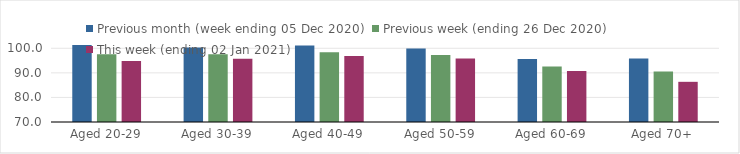
| Category | Previous month (week ending 05 Dec 2020) | Previous week (ending 26 Dec 2020) | This week (ending 02 Jan 2021) |
|---|---|---|---|
| Aged 20-29 | 101.32 | 97.61 | 94.85 |
| Aged 30-39 | 100.3 | 97.61 | 95.76 |
| Aged 40-49 | 101.16 | 98.39 | 96.87 |
| Aged 50-59 | 99.94 | 97.31 | 95.86 |
| Aged 60-69 | 95.62 | 92.56 | 90.78 |
| Aged 70+ | 95.84 | 90.56 | 86.35 |